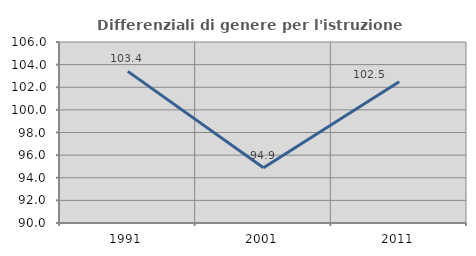
| Category | Differenziali di genere per l'istruzione superiore |
|---|---|
| 1991.0 | 103.403 |
| 2001.0 | 94.877 |
| 2011.0 | 102.496 |